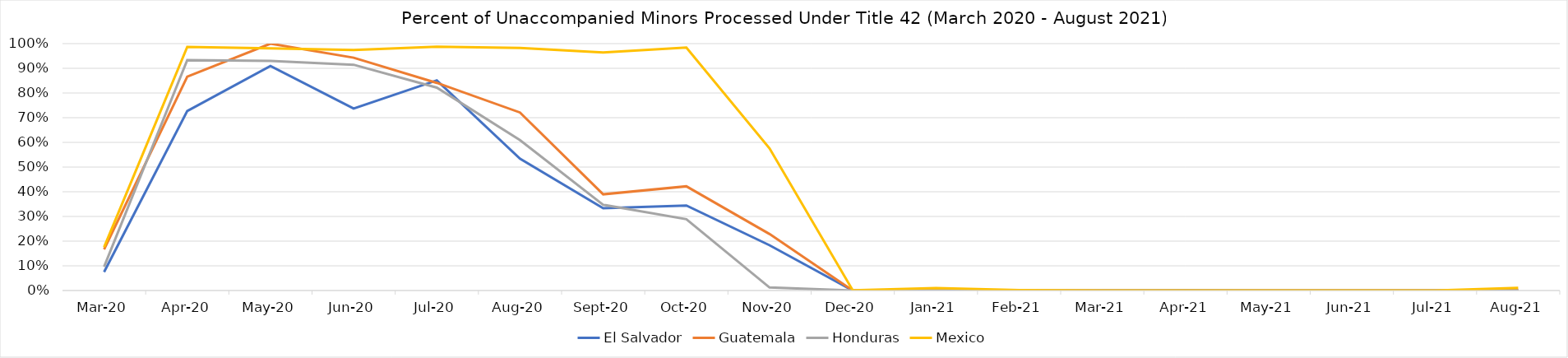
| Category | El Salvador | Guatemala | Honduras | Mexico |
|---|---|---|---|---|
| 2020-03-01 | 0.075 | 0.167 | 0.096 | 0.175 |
| 2020-04-01 | 0.727 | 0.866 | 0.933 | 0.987 |
| 2020-05-01 | 0.909 | 1 | 0.93 | 0.981 |
| 2020-06-01 | 0.737 | 0.943 | 0.914 | 0.974 |
| 2020-07-01 | 0.851 | 0.841 | 0.822 | 0.987 |
| 2020-08-01 | 0.534 | 0.721 | 0.609 | 0.982 |
| 2020-09-01 | 0.333 | 0.39 | 0.347 | 0.964 |
| 2020-10-01 | 0.344 | 0.422 | 0.289 | 0.984 |
| 2020-11-01 | 0.183 | 0.229 | 0.012 | 0.576 |
| 2020-12-01 | 0 | 0 | 0 | 0.001 |
| 2021-01-01 | 0 | 0 | 0 | 0.01 |
| 2021-02-01 | 0 | 0 | 0 | 0.002 |
| 2021-03-01 | 0 | 0 | 0 | 0 |
| 2021-04-01 | 0 | 0 | 0 | 0 |
| 2021-05-01 | 0 | 0 | 0 | 0 |
| 2021-06-01 | 0 | 0 | 0 | 0 |
| 2021-07-01 | 0 | 0 | 0 | 0 |
| 2021-08-01 | 0 | 0 | 0 | 0.01 |